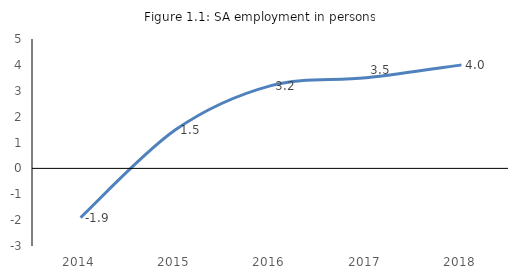
| Category | Employment SA (persons, Statistical Service) |
|---|---|
| 2014.0 | -1.9 |
| 2015.0 | 1.5 |
| 2016.0 | 3.2 |
| 2017.0 | 3.5 |
| 2018.0 | 4 |